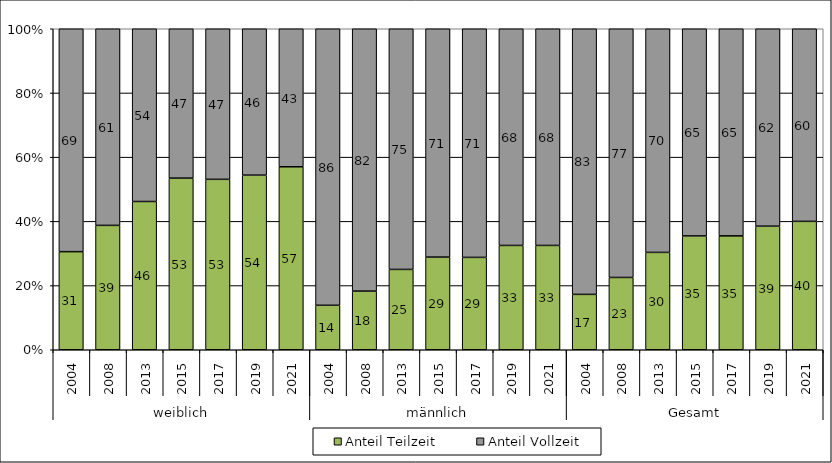
| Category | Anteil Teilzeit | Anteil Vollzeit |
|---|---|---|
| 0 | 30.561 | 69.439 |
| 1 | 38.75 | 61.25 |
| 2 | 46.188 | 53.812 |
| 3 | 53.471 | 46.529 |
| 4 | 53.091 | 46.909 |
| 5 | 54.4 | 45.6 |
| 6 | 57 | 43 |
| 7 | 13.857 | 86.143 |
| 8 | 18.276 | 81.724 |
| 9 | 25.025 | 74.975 |
| 10 | 28.871 | 71.129 |
| 11 | 28.776 | 71.224 |
| 12 | 32.5 | 67.5 |
| 13 | 32.5 | 67.5 |
| 14 | 17.255 | 82.745 |
| 15 | 22.525 | 77.475 |
| 16 | 30.334 | 69.666 |
| 17 | 35.467 | 64.533 |
| 18 | 35.484 | 64.516 |
| 19 | 38.5 | 61.5 |
| 20 | 40 | 60 |